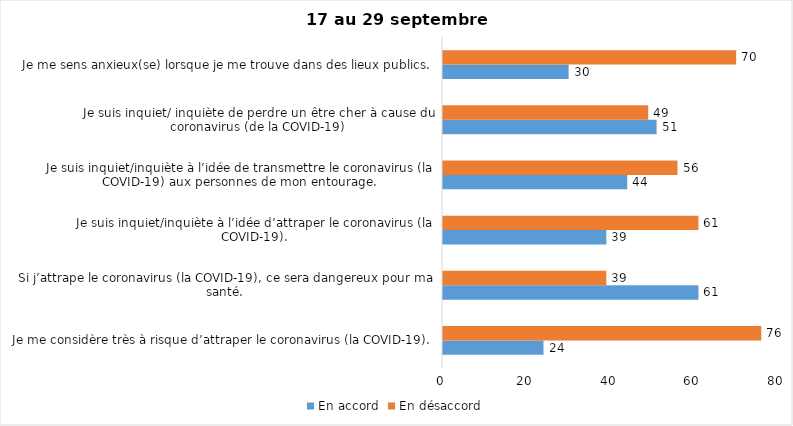
| Category | En accord | En désaccord |
|---|---|---|
| Je me considère très à risque d’attraper le coronavirus (la COVID-19). | 24 | 76 |
| Si j’attrape le coronavirus (la COVID-19), ce sera dangereux pour ma santé. | 61 | 39 |
| Je suis inquiet/inquiète à l’idée d’attraper le coronavirus (la COVID-19). | 39 | 61 |
| Je suis inquiet/inquiète à l’idée de transmettre le coronavirus (la COVID-19) aux personnes de mon entourage. | 44 | 56 |
| Je suis inquiet/ inquiète de perdre un être cher à cause du coronavirus (de la COVID-19) | 51 | 49 |
| Je me sens anxieux(se) lorsque je me trouve dans des lieux publics. | 30 | 70 |